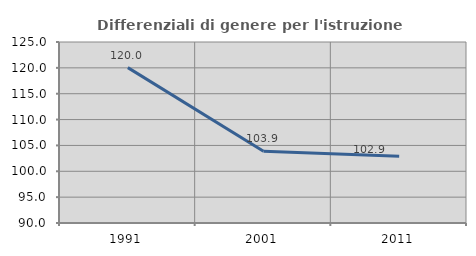
| Category | Differenziali di genere per l'istruzione superiore |
|---|---|
| 1991.0 | 120.049 |
| 2001.0 | 103.887 |
| 2011.0 | 102.895 |